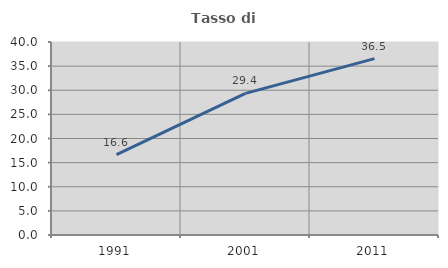
| Category | Tasso di occupazione   |
|---|---|
| 1991.0 | 16.645 |
| 2001.0 | 29.363 |
| 2011.0 | 36.546 |